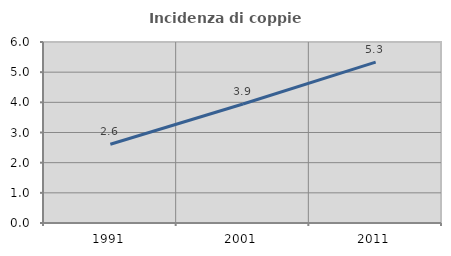
| Category | Incidenza di coppie miste |
|---|---|
| 1991.0 | 2.61 |
| 2001.0 | 3.945 |
| 2011.0 | 5.333 |